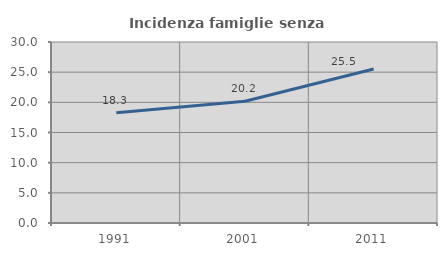
| Category | Incidenza famiglie senza nuclei |
|---|---|
| 1991.0 | 18.291 |
| 2001.0 | 20.189 |
| 2011.0 | 25.527 |